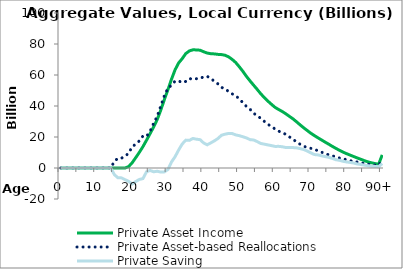
| Category | Private Asset Income | Private Asset-based Reallocations | Private Saving |
|---|---|---|---|
| 0 | 0 | 0.147 | -0.147 |
|  | 0 | 0.081 | -0.081 |
| 2 | 0 | 1 | -1 |
| 3 | 0 | 17.052 | -17.052 |
| 4 | 0 | 30.349 | -30.349 |
| 5 | 0 | 32.212 | -32.212 |
| 6 | 0 | 25.423 | -25.423 |
| 7 | 0 | 25.971 | -25.971 |
| 8 | 0 | 26.449 | -26.449 |
| 9 | 0 | 34.323 | -34.323 |
| 10 | 0 | 39.615 | -39.615 |
| 11 | 0 | 40.448 | -40.448 |
| 12 | 0 | 48.859 | -48.859 |
| 13 | 0 | 55.794 | -55.794 |
| 14 | 0 | 62.543 | -62.543 |
| 15 | 0 | 4268.199 | -4268.199 |
| 16 | 0 | 6320.395 | -6320.395 |
| 17 | 0 | 6373.238 | -6373.238 |
| 18 | 0 | 7519.846 | -7519.846 |
| 19 | 918.164 | 9571.398 | -8653.235 |
| 20 | 3432.395 | 13727.971 | -10295.576 |
| 21 | 6731.088 | 15464.379 | -8733.291 |
| 22 | 10119.999 | 17499.692 | -7379.692 |
| 23 | 13775.296 | 20621.888 | -6846.592 |
| 24 | 17898.386 | 20384.046 | -2485.66 |
| 25 | 22143.714 | 23704.653 | -1560.94 |
| 26 | 26481.433 | 28910.394 | -2428.961 |
| 27 | 31269.68 | 33361.206 | -2091.526 |
| 28 | 37363.002 | 40000.779 | -2637.776 |
| 29 | 44172.167 | 46673.664 | -2501.497 |
| 30 | 50520.317 | 51501.416 | -981.099 |
| 31 | 57269.649 | 53387.472 | 3882.177 |
| 32 | 63354.827 | 56063.479 | 7291.348 |
| 33 | 67767.028 | 56176.683 | 11590.345 |
| 34 | 70554.751 | 55076.05 | 15478.702 |
| 35 | 73827.861 | 55850.078 | 17977.782 |
| 36 | 75544.17 | 57710.835 | 17833.335 |
| 37 | 76250.046 | 57200.116 | 19049.93 |
| 38 | 76183.309 | 57600.169 | 18583.139 |
| 39 | 75991.705 | 57721.579 | 18270.126 |
| 40 | 74998.491 | 58837.229 | 16161.262 |
| 41 | 74160.991 | 59180.925 | 14980.066 |
| 42 | 73738.502 | 57527.306 | 16211.196 |
| 43 | 73609.304 | 56099.183 | 17510.121 |
| 44 | 73309.965 | 54271.655 | 19038.31 |
| 45 | 73159.147 | 52032.731 | 21126.415 |
| 46 | 72746.758 | 50921.33 | 21825.428 |
| 47 | 71690.676 | 49397.239 | 22293.438 |
| 48 | 70047.176 | 47830.731 | 22216.445 |
| 49 | 68008.183 | 46673.764 | 21334.419 |
| 50 | 65259.737 | 44411.695 | 20848.042 |
| 51 | 62310.955 | 42171.931 | 20139.024 |
| 52 | 59061.914 | 39648.733 | 19413.181 |
| 53 | 56156.928 | 37860.711 | 18296.217 |
| 54 | 53412.197 | 35339.122 | 18073.075 |
| 55 | 50701.099 | 33665.268 | 17035.831 |
| 56 | 47854.822 | 32032.958 | 15821.864 |
| 57 | 45424.329 | 30059.949 | 15364.38 |
| 58 | 43129.287 | 28236.955 | 14892.332 |
| 59 | 41066.01 | 26633.334 | 14432.677 |
| 60 | 39114.767 | 25187.49 | 13927.277 |
| 61 | 37743.338 | 23779.077 | 13964.261 |
| 62 | 36466.569 | 22763.251 | 13703.319 |
| 63 | 34985.529 | 21757.471 | 13228.058 |
| 64 | 33338.355 | 20098.956 | 13239.399 |
| 65 | 31733.317 | 18557.727 | 13175.59 |
| 66 | 29835.374 | 16828.056 | 13007.318 |
| 67 | 27857.682 | 15349.477 | 12508.206 |
| 68 | 25968.919 | 14027.374 | 11941.545 |
| 69 | 24197.91 | 13236.235 | 10961.675 |
| 70 | 22449.375 | 12681.202 | 9768.173 |
| 71 | 20920.827 | 12235.964 | 8684.863 |
| 72 | 19487.753 | 11040.588 | 8447.165 |
| 73 | 18099.395 | 10216.58 | 7882.814 |
| 74 | 16724.361 | 9359.488 | 7364.872 |
| 75 | 15399.189 | 8490.384 | 6908.806 |
| 76 | 14011.811 | 7792.53 | 6219.281 |
| 77 | 12688.991 | 7334.02 | 5354.971 |
| 78 | 11447.317 | 6474.084 | 4973.232 |
| 79 | 10298.125 | 5953.845 | 4344.28 |
| 80 | 9269.286 | 5364.871 | 3904.415 |
| 81 | 8340.053 | 4752.646 | 3587.407 |
| 82 | 7409.911 | 4177.67 | 3232.241 |
| 83 | 6487.443 | 3879.963 | 2607.48 |
| 84 | 5629.625 | 3329.121 | 2300.504 |
| 85 | 4748.962 | 2906.151 | 1842.812 |
| 86 | 3943.387 | 2458.391 | 1484.995 |
| 87 | 3350.58 | 2163.056 | 1187.524 |
| 88 | 2852.248 | 1825.688 | 1026.56 |
| 89 | 2433.03 | 1630.852 | 802.177 |
| 90+ | 8458.075 | 5561.34 | 2896.735 |